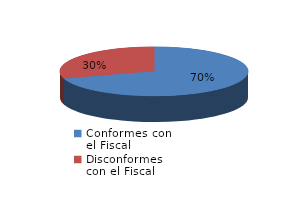
| Category | Series 0 |
|---|---|
| 0 | 26 |
| 1 | 11 |